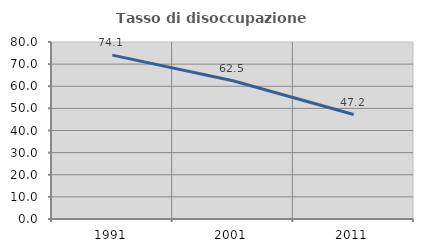
| Category | Tasso di disoccupazione giovanile  |
|---|---|
| 1991.0 | 74.064 |
| 2001.0 | 62.477 |
| 2011.0 | 47.228 |